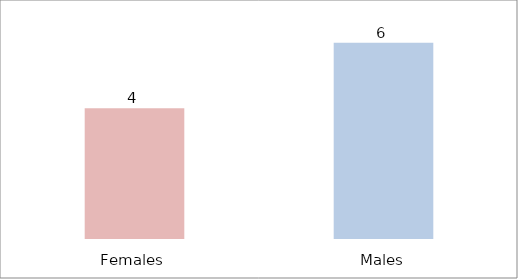
| Category | Média dos erros |
|---|---|
| Females | 4 |
| Males | 6 |